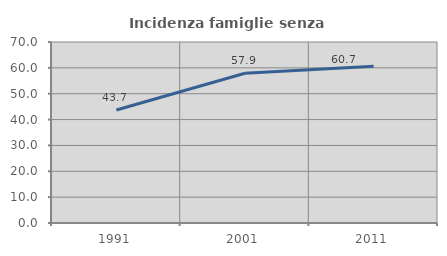
| Category | Incidenza famiglie senza nuclei |
|---|---|
| 1991.0 | 43.709 |
| 2001.0 | 57.895 |
| 2011.0 | 60.667 |